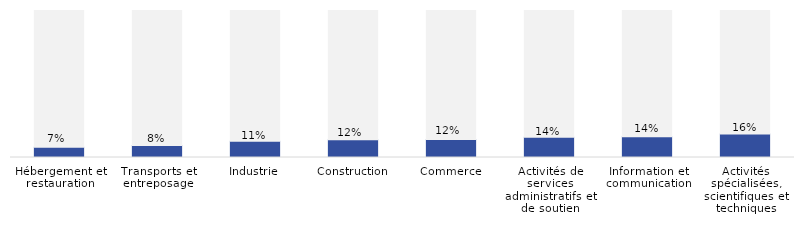
| Category | Series 0 | Series 1 |
|---|---|---|
| Hébergement et restauration | 0.07 | 0.93 |
| Transports et entreposage | 0.082 | 0.918 |
| Industrie | 0.111 | 0.889 |
| Construction | 0.121 | 0.879 |
| Commerce | 0.123 | 0.877 |
| Activités de services administratifs et de soutien | 0.137 | 0.863 |
| Information et communication | 0.141 | 0.859 |
| Activités spécialisées, scientifiques et techniques | 0.16 | 0.84 |